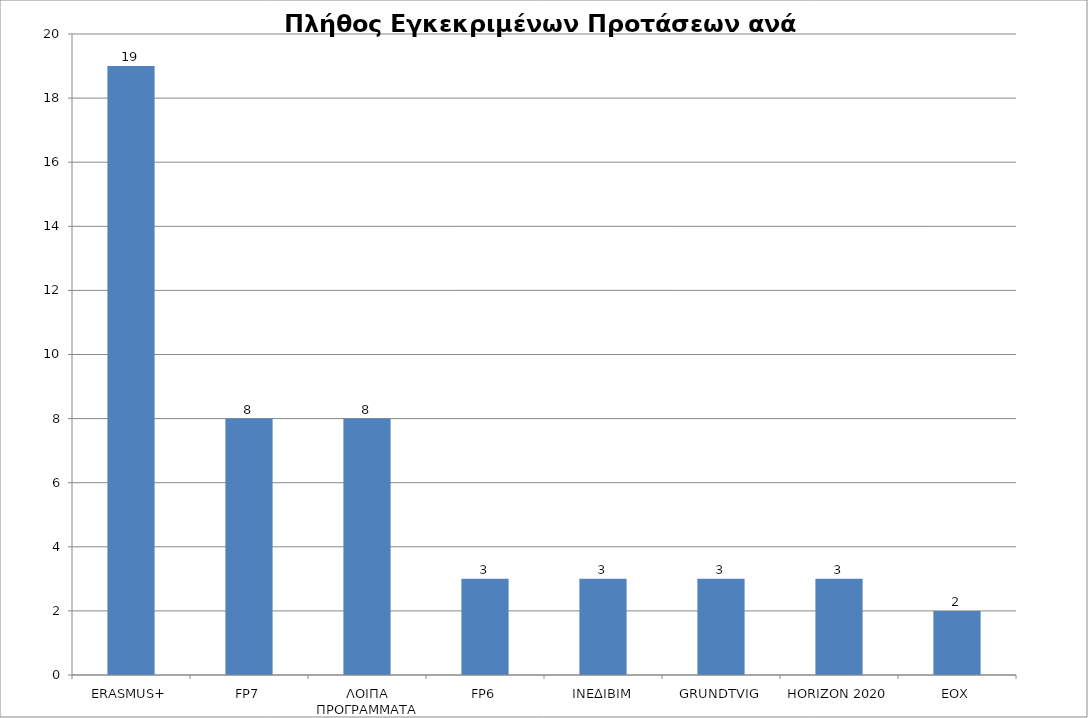
| Category | Series 0 |
|---|---|
| ERASMUS+ | 19 |
| FP7 | 8 |
| ΛΟΙΠΑ ΠΡΟΓΡΑΜΜΑΤΑ | 8 |
| FP6 | 3 |
| ΙΝΕΔΙΒΙΜ | 3 |
| GRUNDTVIG | 3 |
| HORIZON 2020 | 3 |
| EOX | 2 |